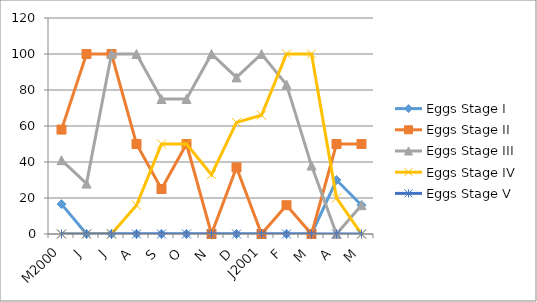
| Category | Eggs |
|---|---|
| M2000 | 0 |
| J | 0 |
| J | 0 |
| A | 0 |
| S | 0 |
| O | 0 |
| N | 0 |
| D | 0 |
| J2001 | 0 |
| F | 0 |
| M | 0 |
| A | 0 |
| M | 0 |